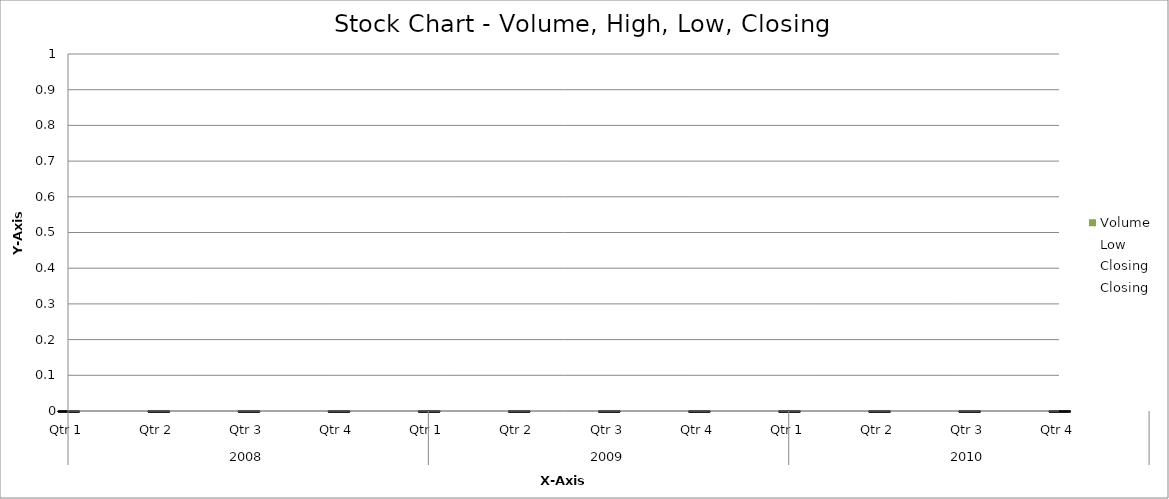
| Category | Volume |
|---|---|
| 0 | 147 |
| 1 | 133 |
| 2 | 150 |
| 3 | 146 |
| 4 | 125 |
| 5 | 136 |
| 6 | 145 |
| 7 | 130 |
| 8 | 133 |
| 9 | 146 |
| 10 | 136 |
| 11 | 146 |